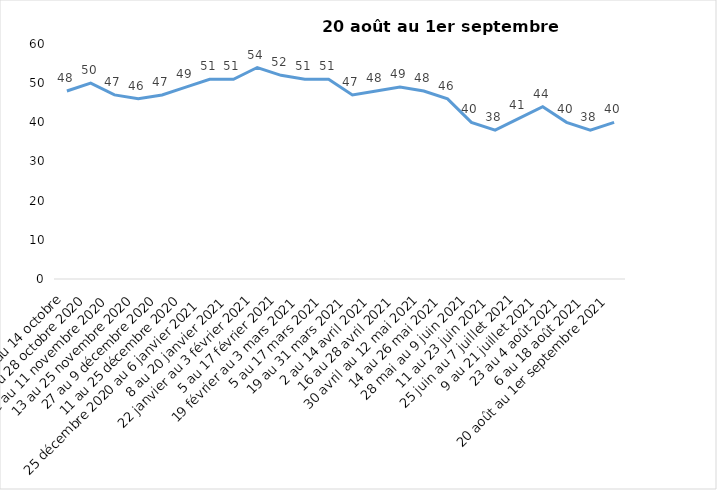
| Category | Toujours aux trois mesures |
|---|---|
| 2 au 14 octobre | 48 |
| 16 au 28 octobre 2020 | 50 |
| 30 octobre au 11 novembre 2020 | 47 |
| 13 au 25 novembre 2020 | 46 |
| 27 au 9 décembre 2020 | 47 |
| 11 au 25 décembre 2020 | 49 |
| 25 décembre 2020 au 6 janvier 2021 | 51 |
| 8 au 20 janvier 2021 | 51 |
| 22 janvier au 3 février 2021 | 54 |
| 5 au 17 février 2021 | 52 |
| 19 février au 3 mars 2021 | 51 |
| 5 au 17 mars 2021 | 51 |
| 19 au 31 mars 2021 | 47 |
| 2 au 14 avril 2021 | 48 |
| 16 au 28 avril 2021 | 49 |
| 30 avril au 12 mai 2021 | 48 |
| 14 au 26 mai 2021 | 46 |
| 28 mai au 9 juin 2021 | 40 |
| 11 au 23 juin 2021 | 38 |
| 25 juin au 7 juillet 2021 | 41 |
| 9 au 21 juillet 2021 | 44 |
| 23 au 4 août 2021 | 40 |
| 6 au 18 août 2021 | 38 |
| 20 août au 1er septembre 2021 | 40 |